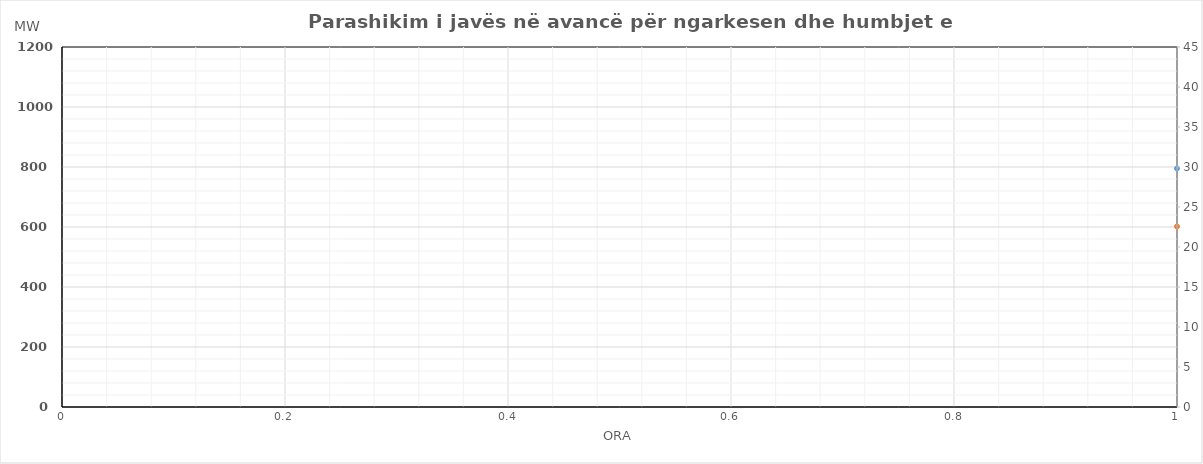
| Category | Ngarkesa (MWh) |
|---|---|
| 0 | 601.521 |
| 1 | 550.831 |
| 2 | 535.179 |
| 3 | 518.289 |
| 4 | 526.883 |
| 5 | 561.019 |
| 6 | 651.585 |
| 7 | 781.918 |
| 8 | 873.306 |
| 9 | 905.482 |
| 10 | 892.36 |
| 11 | 891.473 |
| 12 | 879.993 |
| 13 | 885.369 |
| 14 | 856.247 |
| 15 | 829.661 |
| 16 | 815.078 |
| 17 | 835.264 |
| 18 | 860.499 |
| 19 | 900.038 |
| 20 | 962.207 |
| 21 | 907.563 |
| 22 | 796.454 |
| 23 | 682.231 |
| 24 | 613.314 |
| 25 | 563.652 |
| 26 | 547.397 |
| 27 | 537.404 |
| 28 | 535.961 |
| 29 | 567.751 |
| 30 | 643.164 |
| 31 | 747.009 |
| 32 | 843.377 |
| 33 | 875.339 |
| 34 | 891.265 |
| 35 | 886.803 |
| 36 | 882.734 |
| 37 | 867.081 |
| 38 | 835.659 |
| 39 | 804.859 |
| 40 | 815.826 |
| 41 | 827.558 |
| 42 | 848.73 |
| 43 | 908.394 |
| 44 | 998.104 |
| 45 | 948.618 |
| 46 | 839.238 |
| 47 | 715.573 |
| 48 | 620.811 |
| 49 | 572.085 |
| 50 | 549.905 |
| 51 | 541.909 |
| 52 | 549.58 |
| 53 | 594.6 |
| 54 | 681.892 |
| 55 | 826.786 |
| 56 | 874.573 |
| 57 | 854.4 |
| 58 | 840.704 |
| 59 | 839.306 |
| 60 | 842.362 |
| 61 | 846.63 |
| 62 | 834.21 |
| 63 | 811.278 |
| 64 | 820.189 |
| 65 | 846.28 |
| 66 | 883.409 |
| 67 | 924.563 |
| 68 | 952.386 |
| 69 | 880.696 |
| 70 | 789.173 |
| 71 | 686.297 |
| 72 | 614.314 |
| 73 | 564.652 |
| 74 | 548.397 |
| 75 | 538.404 |
| 76 | 536.961 |
| 77 | 568.751 |
| 78 | 644.164 |
| 79 | 748.009 |
| 80 | 844.377 |
| 81 | 876.339 |
| 82 | 892.265 |
| 83 | 887.803 |
| 84 | 883.734 |
| 85 | 868.081 |
| 86 | 836.659 |
| 87 | 805.859 |
| 88 | 816.826 |
| 89 | 828.558 |
| 90 | 849.73 |
| 91 | 909.394 |
| 92 | 999.104 |
| 93 | 949.618 |
| 94 | 840.238 |
| 95 | 716.573 |
| 96 | 613.811 |
| 97 | 565.085 |
| 98 | 542.905 |
| 99 | 534.909 |
| 100 | 542.58 |
| 101 | 587.6 |
| 102 | 674.892 |
| 103 | 819.786 |
| 104 | 867.573 |
| 105 | 847.4 |
| 106 | 833.704 |
| 107 | 832.306 |
| 108 | 835.362 |
| 109 | 839.63 |
| 110 | 827.21 |
| 111 | 804.278 |
| 112 | 813.189 |
| 113 | 839.28 |
| 114 | 876.409 |
| 115 | 917.563 |
| 116 | 945.386 |
| 117 | 873.696 |
| 118 | 782.173 |
| 119 | 679.297 |
| 120 | 600.521 |
| 121 | 549.831 |
| 122 | 534.179 |
| 123 | 517.289 |
| 124 | 525.883 |
| 125 | 560.019 |
| 126 | 650.585 |
| 127 | 780.918 |
| 128 | 872.306 |
| 129 | 904.482 |
| 130 | 891.36 |
| 131 | 890.473 |
| 132 | 878.993 |
| 133 | 884.369 |
| 134 | 855.247 |
| 135 | 828.661 |
| 136 | 814.078 |
| 137 | 834.264 |
| 138 | 859.499 |
| 139 | 899.038 |
| 140 | 961.207 |
| 141 | 906.563 |
| 142 | 795.454 |
| 143 | 681.231 |
| 144 | 598.521 |
| 145 | 547.831 |
| 146 | 532.179 |
| 147 | 515.289 |
| 148 | 523.883 |
| 149 | 558.019 |
| 150 | 648.585 |
| 151 | 778.918 |
| 152 | 870.306 |
| 153 | 902.482 |
| 154 | 889.36 |
| 155 | 888.473 |
| 156 | 876.993 |
| 157 | 882.369 |
| 158 | 853.247 |
| 159 | 826.661 |
| 160 | 812.078 |
| 161 | 832.264 |
| 162 | 857.499 |
| 163 | 897.038 |
| 164 | 959.207 |
| 165 | 904.563 |
| 166 | 793.454 |
| 167 | 679.231 |